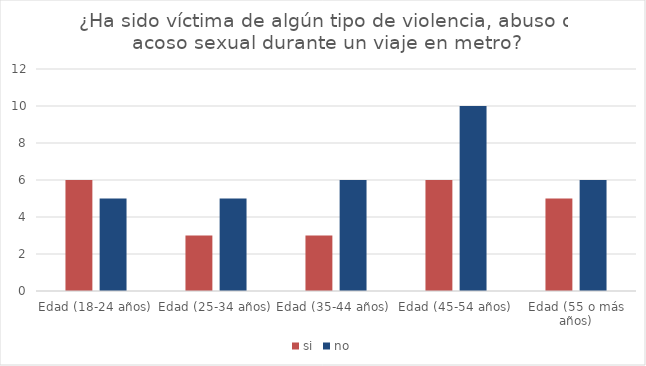
| Category | si | no |
|---|---|---|
| Edad (18-24 años) | 6 | 5 |
| Edad (25-34 años) | 3 | 5 |
| Edad (35-44 años)  | 3 | 6 |
| Edad (45-54 años) | 6 | 10 |
| Edad (55 o más años) | 5 | 6 |